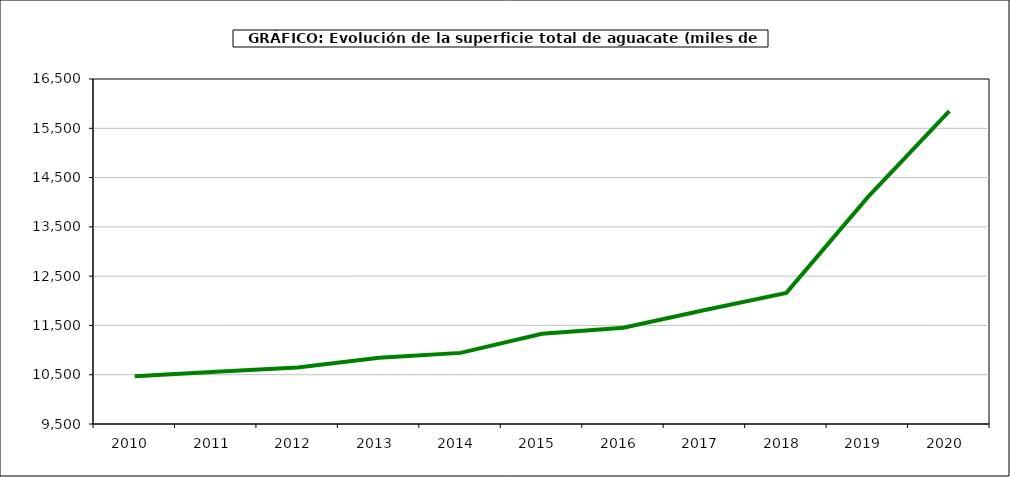
| Category | superficie aguacate |
|---|---|
| 2010.0 | 10470 |
| 2011.0 | 10558 |
| 2012.0 | 10645 |
| 2013.0 | 10845 |
| 2014.0 | 10943 |
| 2015.0 | 11329 |
| 2016.0 | 11455 |
| 2017.0 | 11812 |
| 2018.0 | 12161 |
| 2019.0 | 14104 |
| 2020.0 | 15849 |